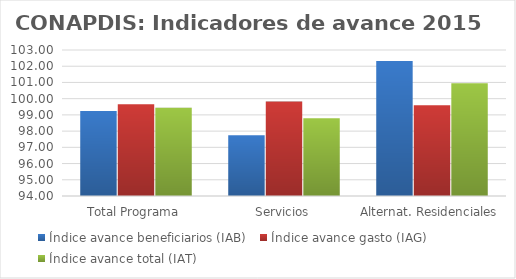
| Category | Índice avance beneficiarios (IAB)  | Índice avance gasto (IAG) | Índice avance total (IAT)  |
|---|---|---|---|
| Total Programa | 99.242 | 99.65 | 99.446 |
| Servicios | 97.749 | 99.822 | 98.785 |
| Alternat. Residenciales | 102.317 | 99.592 | 100.954 |